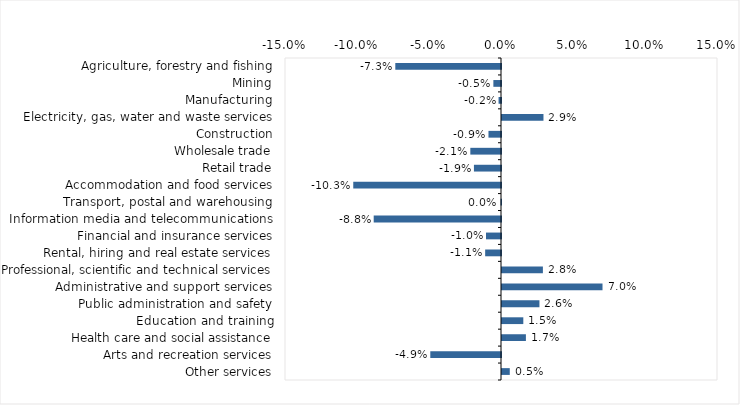
| Category | This week |
|---|---|
| Agriculture, forestry and fishing | -0.073 |
| Mining | -0.005 |
| Manufacturing | -0.002 |
| Electricity, gas, water and waste services | 0.029 |
| Construction | -0.009 |
| Wholesale trade | -0.021 |
| Retail trade | -0.019 |
| Accommodation and food services | -0.103 |
| Transport, postal and warehousing | 0 |
| Information media and telecommunications | -0.088 |
| Financial and insurance services | -0.01 |
| Rental, hiring and real estate services | -0.011 |
| Professional, scientific and technical services | 0.028 |
| Administrative and support services | 0.07 |
| Public administration and safety | 0.026 |
| Education and training | 0.015 |
| Health care and social assistance | 0.017 |
| Arts and recreation services | -0.049 |
| Other services | 0.005 |